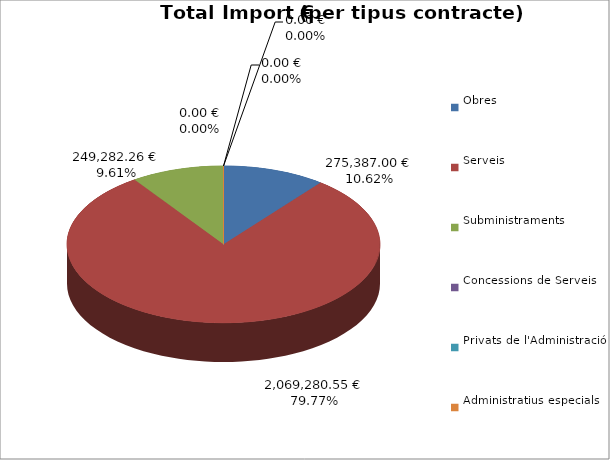
| Category | Total preu
(amb IVA) |
|---|---|
| Obres | 275387 |
| Serveis | 2069280.55 |
| Subministraments | 249282.26 |
| Concessions de Serveis | 0 |
| Privats de l'Administració | 0 |
| Administratius especials | 0 |